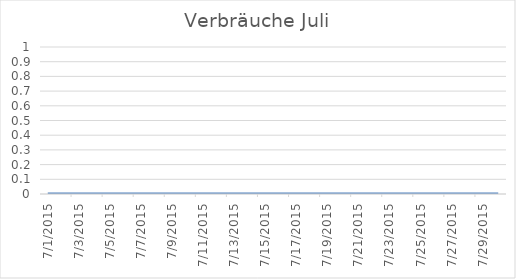
| Category | Series 0 |
|---|---|
| 01/07/2015 | 0 |
| 02/07/2015 | 0 |
| 03/07/2015 | 0 |
| 04/07/2015 | 0 |
| 05/07/2015 | 0 |
| 06/07/2015 | 0 |
| 07/07/2015 | 0 |
| 08/07/2015 | 0 |
| 09/07/2015 | 0 |
| 10/07/2015 | 0 |
| 11/07/2015 | 0 |
| 12/07/2015 | 0 |
| 13/07/2015 | 0 |
| 14/07/2015 | 0 |
| 15/07/2015 | 0 |
| 16/07/2015 | 0 |
| 17/07/2015 | 0 |
| 18/07/2015 | 0 |
| 19/07/2015 | 0 |
| 20/07/2015 | 0 |
| 21/07/2015 | 0 |
| 22/07/2015 | 0 |
| 23/07/2015 | 0 |
| 24/07/2015 | 0 |
| 25/07/2015 | 0 |
| 26/07/2015 | 0 |
| 27/07/2015 | 0 |
| 28/07/2015 | 0 |
| 29/07/2015 | 0 |
| 30/07/2015 | 0 |